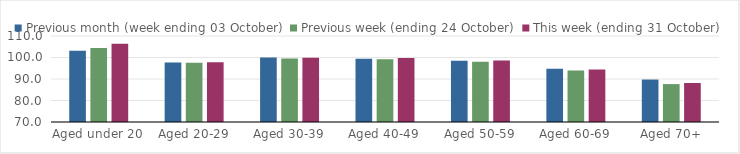
| Category | Previous month (week ending 03 October) | Previous week (ending 24 October) | This week (ending 31 October) |
|---|---|---|---|
| Aged under 20 | 103.15 | 104.39 | 106.41 |
| Aged 20-29 | 97.73 | 97.58 | 97.81 |
| Aged 30-39 | 100.01 | 99.5 | 99.84 |
| Aged 40-49 | 99.47 | 99.21 | 99.73 |
| Aged 50-59 | 98.5 | 98.06 | 98.56 |
| Aged 60-69 | 94.82 | 93.92 | 94.38 |
| Aged 70+ | 89.75 | 87.63 | 88.14 |